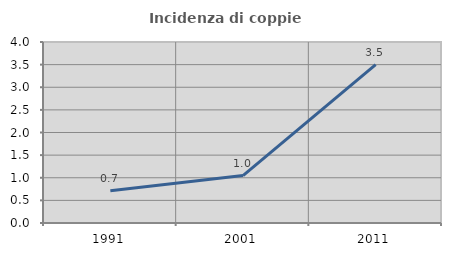
| Category | Incidenza di coppie miste |
|---|---|
| 1991.0 | 0.711 |
| 2001.0 | 1.048 |
| 2011.0 | 3.499 |